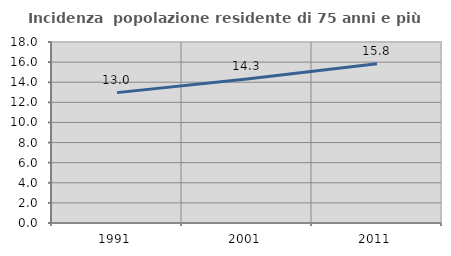
| Category | Incidenza  popolazione residente di 75 anni e più |
|---|---|
| 1991.0 | 12.966 |
| 2001.0 | 14.327 |
| 2011.0 | 15.83 |